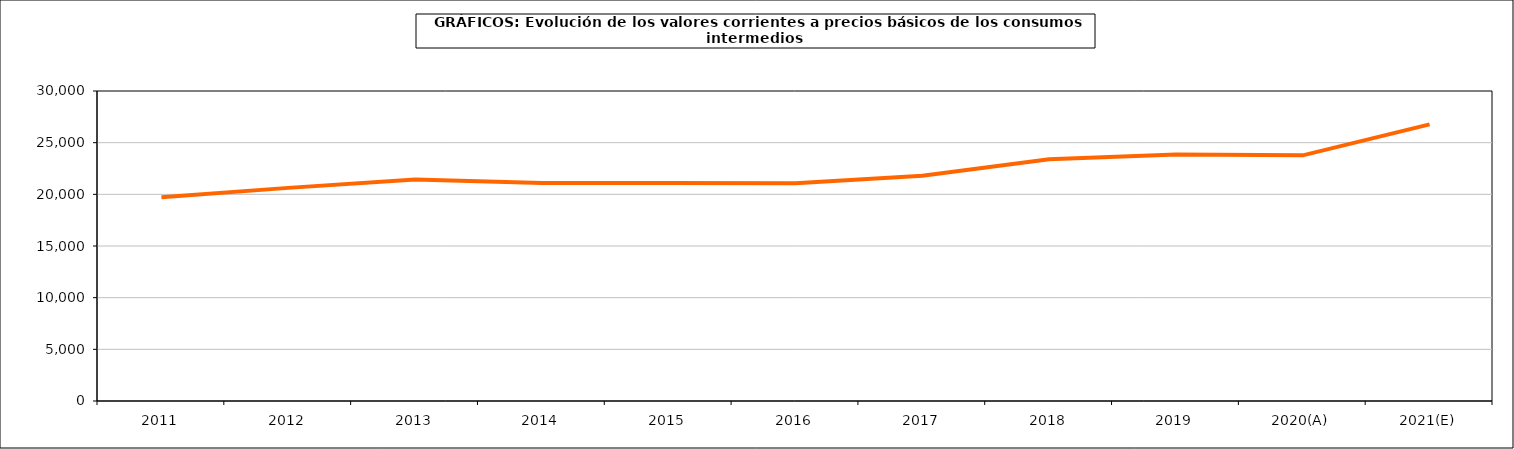
| Category | Total consumos intermedios |
|---|---|
| 2011 | 19714.8 |
| 2012 | 20625.1 |
| 2013 | 21445.2 |
| 2014 | 21097.4 |
| 2015 | 21104.1 |
| 2016 | 21083.6 |
| 2017 | 21794.5 |
| 2018 | 23401.5 |
| 2019 | 23844.5 |
| 2020(A) | 23774.1 |
| 2021(E) | 26774.5 |